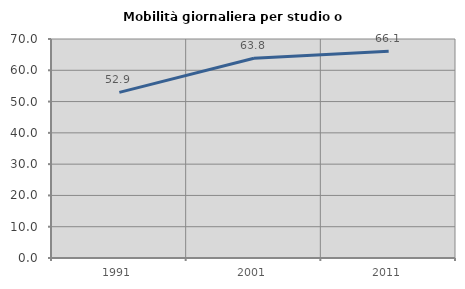
| Category | Mobilità giornaliera per studio o lavoro |
|---|---|
| 1991.0 | 52.941 |
| 2001.0 | 63.834 |
| 2011.0 | 66.118 |